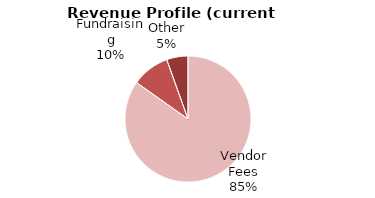
| Category | Current year |
|---|---|
| Vendor Fees | 654281 |
| Fundraising | 75000 |
| Other | 42229 |